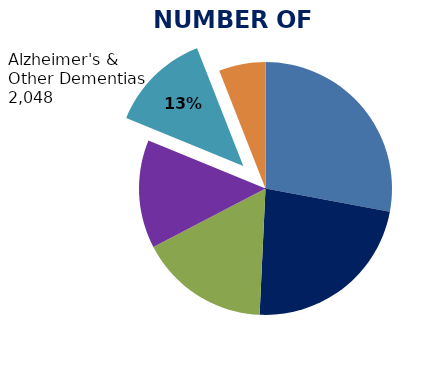
| Category | Cancer (C00-C97) |
|---|---|
| 0 | 4448 |
| 1 | 3632 |
| 2 | 2645 |
| 3 | 2202 |
| 4 | 2048 |
| 5 | 948 |